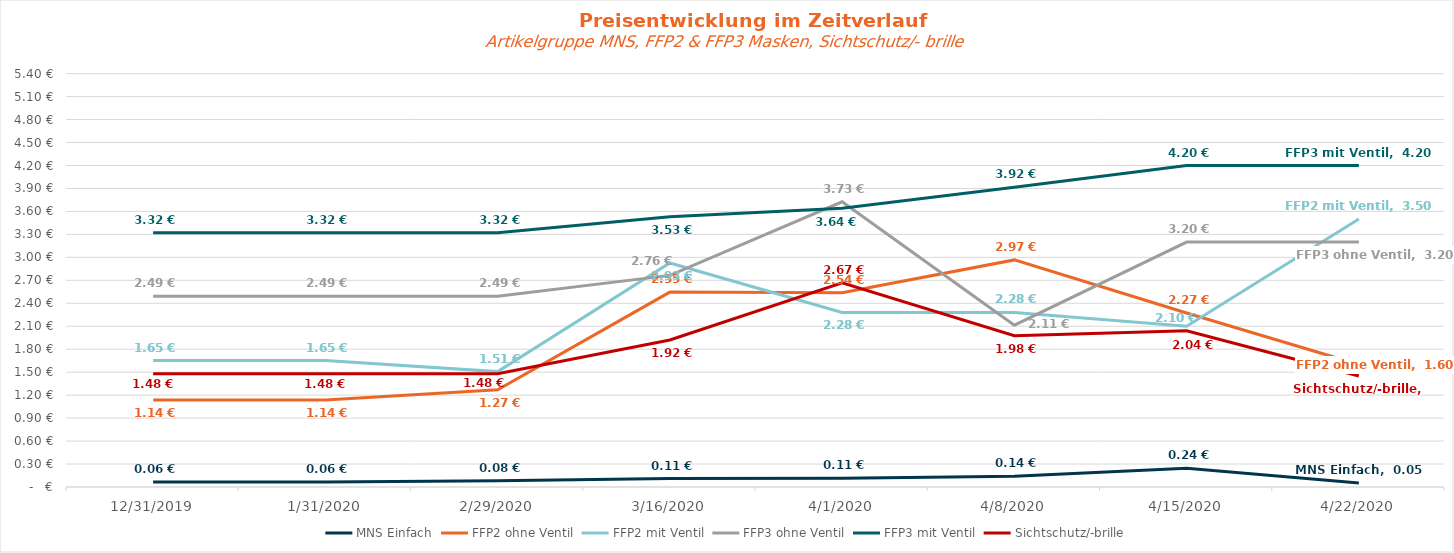
| Category | MNS Einfach | FFP2 ohne Ventil | FFP2 mit Ventil | FFP3 ohne Ventil | FFP3 mit Ventil | Sichtschutz/-brille |
|---|---|---|---|---|---|---|
| 12/31/19 | 0.064 | 1.138 | 1.652 | 2.493 | 3.32 | 1.48 |
| 1/31/20 | 0.064 | 1.138 | 1.652 | 2.493 | 3.32 | 1.48 |
| 2/29/20 | 0.082 | 1.27 | 1.508 | 2.493 | 3.32 | 1.48 |
| 3/16/20 | 0.11 | 2.546 | 2.927 | 2.765 | 3.53 | 1.92 |
| 4/1/20 | 0.114 | 2.538 | 2.28 | 3.726 | 3.641 | 2.666 |
| 4/8/20 | 0.141 | 2.967 | 2.28 | 2.114 | 3.917 | 1.978 |
| 4/15/20 | 0.244 | 2.272 | 2.1 | 3.2 | 4.2 | 2.042 |
| 4/22/20 | 0.054 | 1.6 | 3.5 | 3.2 | 4.2 | 1.45 |